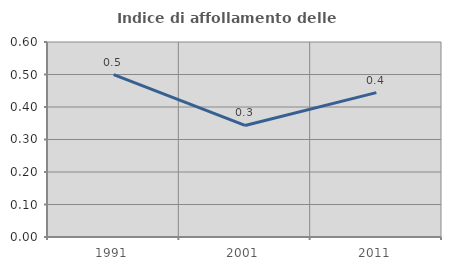
| Category | Indice di affollamento delle abitazioni  |
|---|---|
| 1991.0 | 0.5 |
| 2001.0 | 0.343 |
| 2011.0 | 0.444 |